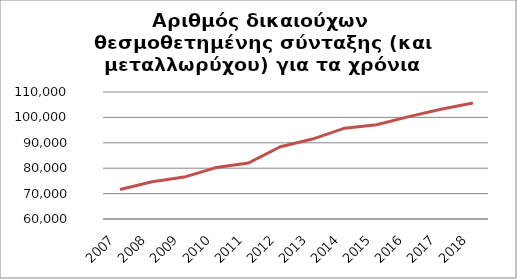
| Category | Series 1 |
|---|---|
| 2007.0 | 71621 |
| 2008.0 | 74642 |
| 2009.0 | 76508 |
| 2010.0 | 80261 |
| 2011.0 | 82038 |
| 2012.0 | 88453 |
| 2013.0 | 91472 |
| 2014.0 | 95747 |
| 2015.0 | 97134 |
| 2016.0 | 100305 |
| 2017.0 | 103238 |
| 2018.0 | 105648 |